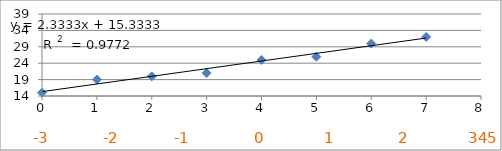
| Category | Series 0 |
|---|---|
| 0.0 | 15 |
| 1.0 | 19 |
| 2.0 | 20 |
| 3.0 | 21 |
| 4.0 | 25 |
| 5.0 | 26 |
| 6.0 | 30 |
| 7.0 | 32 |